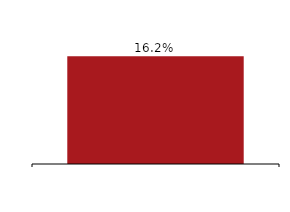
| Category | Leverage ratio |
|---|---|
|  | 0.162 |